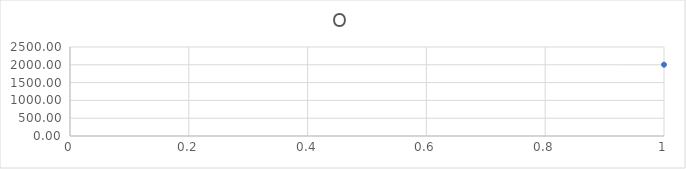
| Category | O |
|---|---|
| 0 | 2003.142 |
| 1 | 1012.566 |
| 2 | 694.94 |
| 3 | 550.264 |
| 4 | 478.538 |
| 5 | 446.427 |
| 6 | 439.648 |
| 7 | 451.056 |
| 8 | 476.684 |
| 9 | 514.15 |